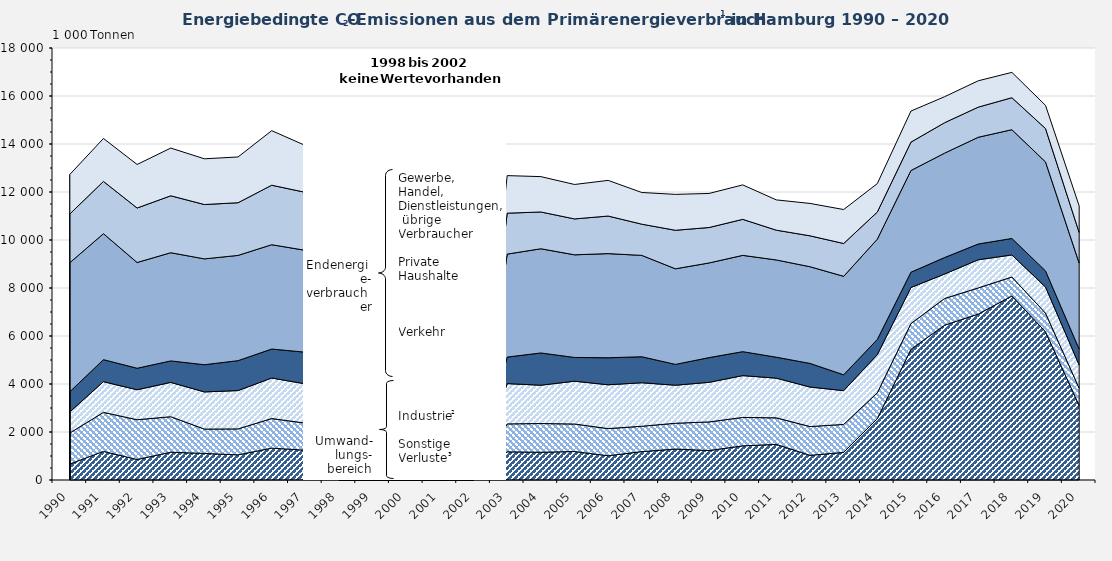
| Category | Stromerzeugung | Fernwärmeerzeugung | Sonstige Verluste2 | Gewinnung von Steinen und Erden, sonst. Bergbau, Verarbeitendes Gewerbe | Verkehr | Private Haushalte | Gewerbe, Handel, Dienstleistungen, 
übrige Verbraucher |
|---|---|---|---|---|---|---|---|
| 1990.0 | 667.234 | 1293.056 | 878.022 | 838.375 | 5376.032 | 2031.727 | 1645.735 |
| 1991.0 | 1192.495 | 1625.018 | 1279.399 | 917.622 | 5248.049 | 2178.22 | 1789.799 |
| 1992.0 | 853.721 | 1657.837 | 1248.869 | 896.097 | 4406.531 | 2269.573 | 1814.376 |
| 1993.0 | 1158.684 | 1478.514 | 1430.467 | 893.979 | 4507.948 | 2372.24 | 1988.483 |
| 1994.0 | 1106.375 | 1015.464 | 1548.45 | 1133.267 | 4409.767 | 2265.053 | 1904.575 |
| 1995.0 | 1048.124 | 1080.494 | 1597.956 | 1246.689 | 4384.807 | 2195.159 | 1906.947 |
| 1996.0 | 1328.047 | 1232.962 | 1689.083 | 1207.184 | 4346.529 | 2479.059 | 2272.769 |
| 1997.0 | 1241.945 | 1128.016 | 1636.466 | 1318.545 | 4245.179 | 2416.079 | 1952.26 |
| 1998.0 | 0 | 0 | 0 | 0 | 0 | 0 | 0 |
| 1999.0 | 0 | 0 | 0 | 0 | 0 | 0 | 0 |
| 2000.0 | 0 | 0 | 0 | 0 | 0 | 0 | 0 |
| 2001.0 | 0 | 0 | 0 | 0 | 0 | 0 | 0 |
| 2002.0 | 0 | 0 | 0 | 0 | 0 | 0 | 0 |
| 2003.0 | 1173.28 | 1165.155 | 1677.45 | 1105.942 | 4290.451 | 1705.148 | 1565.068 |
| 2004.0 | 1155.991 | 1197.455 | 1596.465 | 1343.69 | 4341.193 | 1533.008 | 1473.155 |
| 2005.0 | 1186.639 | 1146.306 | 1784.1 | 989.577 | 4275.655 | 1496.285 | 1434.78 |
| 2006.0 | 1010.943 | 1130.721 | 1825.824 | 1125.719 | 4339.213 | 1565.88 | 1485.8 |
| 2007.0 | 1183.43 | 1056.389 | 1812.278 | 1083.927 | 4222.839 | 1300.327 | 1320.2 |
| 2008.0 | 1289.998 | 1074.775 | 1584.577 | 868.288 | 3982.22 | 1605.323 | 1495.816 |
| 2009.0 | 1227.625 | 1192.26 | 1651.064 | 1028.45 | 3944.076 | 1476.988 | 1419.579 |
| 2010.0 | 1422.675 | 1184.203 | 1742.911 | 998.496 | 4011.484 | 1500.813 | 1435.056 |
| 2011.0 | 1484.694 | 1105.401 | 1653.977 | 871.981 | 4052.288 | 1241.124 | 1261.111 |
| 2012.0 | 1028.555 | 1199.078 | 1646.821 | 983.326 | 4028.454 | 1288.044 | 1349.33 |
| 2013.0 | 1151.439 | 1165.007 | 1407.191 | 659.862 | 4104.059 | 1366.337 | 1415.203 |
| 2014.0 | 2556.498 | 1074.432 | 1591.964 | 632.802 | 4177.052 | 1130.672 | 1186.634 |
| 2015.0 | 5446.803 | 1071.122 | 1503.382 | 636.702 | 4236.111 | 1184.332 | 1294.08 |
| 2016.0 | 6451.487 | 1111.208 | 1020.551 | 686.129 | 4350.391 | 1267.551 | 1082.96 |
| 2017.0 | 6914.235 | 1089.285 | 1174.077 | 655.086 | 4447.345 | 1255.872 | 1098.01 |
| 2018.0 | 7667.019 | 790.393 | 920.517 | 685.889 | 4532.12 | 1333.464 | 1054.534 |
| 2019.0 | 6176.21 | 775.774 | 1089.084 | 670.932 | 4540.646 | 1391.343 | 964.885 |
| 2020.0 | 3101.977 | 721.177 | 969.286 | 659.6 | 3586.276 | 1273.79 | 1107.155 |